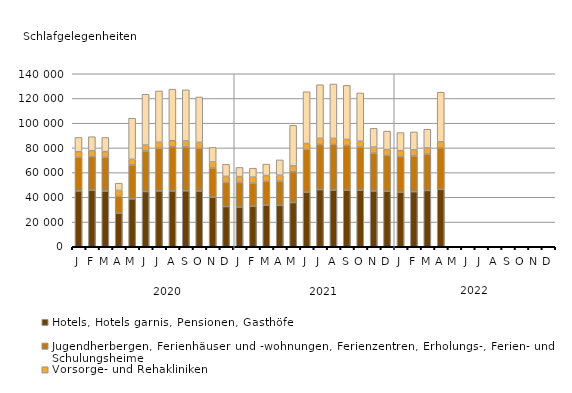
| Category | Hotels, Hotels garnis, Pensionen, Gasthöfe | Jugendherbergen, Ferienhäuser und -wohnungen, Ferienzentren, Erholungs-, Ferien- und Schulungsheime | Vorsorge- und Rehakliniken | Campingplätze |
|---|---|---|---|---|
| J | 45194 | 27141 | 4614 | 11524 |
| F | 45678 | 27259 | 4646 | 11472 |
| M | 45137 | 27233 | 4622 | 11448 |
| A | 27192 | 13746 | 4636 | 5904 |
| M | 38775 | 27412 | 4500 | 33336 |
| J | 44712 | 32789 | 4759 | 41140 |
| J | 45185 | 34568 | 4784 | 41604 |
| A | 45168 | 35858 | 4793 | 41740 |
| S | 45280 | 35539 | 4799 | 41384 |
| O | 45158 | 34521 | 4781 | 36748 |
| N | 40126 | 23570 | 4834 | 11860 |
| D | 32528 | 19522 | 4845 | 9784 |
| J | 32157 | 19770 | 4838 | 7440 |
| F | 32750 | 18686 | 4843 | 7304 |
| M | 33573 | 19234 | 4803 | 9268 |
| A | 33513 | 19602 | 4699 | 12484 |
| M | 35779 | 24837 | 4782 | 32856 |
| J | 44205 | 34421 | 4889 | 41912 |
| J | 46200 | 36612 | 4894 | 43436 |
| A | 45941 | 36895 | 4876 | 43960 |
| S | 45721 | 36241 | 4882 | 43772 |
| O | 45818 | 34673 | 4891 | 39088 |
| N | 45168 | 30566 | 4861 | 15216 |
| D | 44926 | 28936 | 4847 | 14868 |
| J | 44196 | 28735 | 4844 | 14608 |
| F | 44561 | 28956 | 4828 | 14604 |
| M | 45552 | 29466 | 4887 | 15204 |
| A | 46458 | 33538 | 4866 | 40156 |
| M | 0 | 0 | 0 | 0 |
| J | 0 | 0 | 0 | 0 |
| J | 0 | 0 | 0 | 0 |
| A | 0 | 0 | 0 | 0 |
| S | 0 | 0 | 0 | 0 |
| O | 0 | 0 | 0 | 0 |
| N | 0 | 0 | 0 | 0 |
| D | 0 | 0 | 0 | 0 |